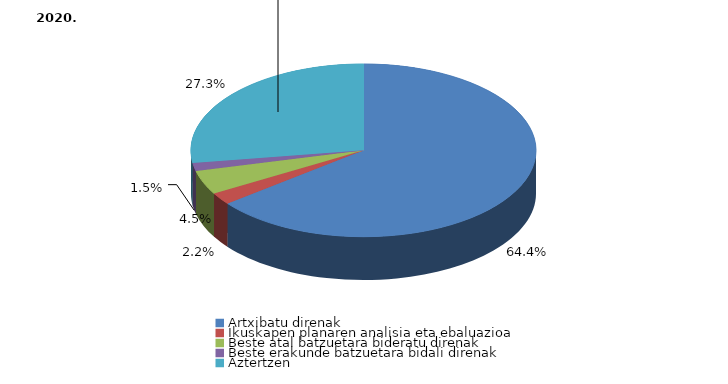
| Category | Series 0 |
|---|---|
| Artxibatu direnak | 172 |
| Ikuskapen planaren analisia eta ebaluazioa | 6 |
| Beste atal batzuetara bideratu direnak | 12 |
| Beste erakunde batzuetara bidali direnak | 4 |
| Aztertzen | 73 |